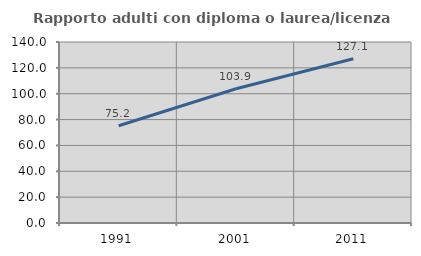
| Category | Rapporto adulti con diploma o laurea/licenza media  |
|---|---|
| 1991.0 | 75.223 |
| 2001.0 | 103.852 |
| 2011.0 | 127.055 |